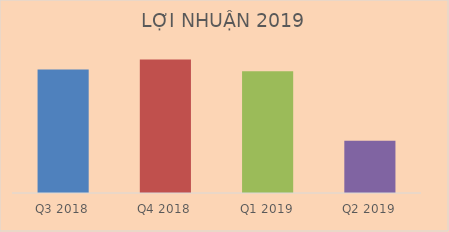
| Category | Doanh thu thuần |
|---|---|
| Q3 2018 | 2031804100334 |
| Q4 2018 | 2195442651915 |
| Q1 2019 | 2002888209392 |
| Q2 2019 | 859762374229 |